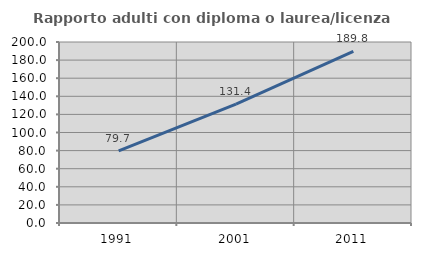
| Category | Rapporto adulti con diploma o laurea/licenza media  |
|---|---|
| 1991.0 | 79.686 |
| 2001.0 | 131.399 |
| 2011.0 | 189.755 |